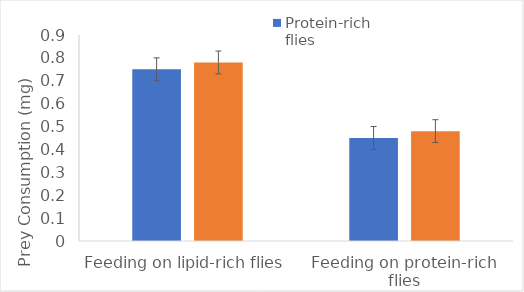
| Category | Protein-rich flies | Lipid-rich flies |
|---|---|---|
| Feeding on lipid-rich flies | 0.75 | 0.78 |
| Feeding on protein-rich flies | 0.45 | 0.48 |